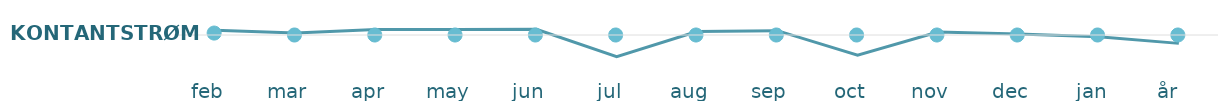
| Category | Kontantstrøm |
|---|---|
| feb  | 169 |
| mar  | 69 |
| apr  | 192 |
| may  | 199 |
| jun  | 204 |
| jul  | -771 |
| aug  | 124 |
| sep  | 154 |
| oct  | -721 |
| nov  | 109 |
| dec  | 34 |
| jan  | -61 |
| år   | -299 |